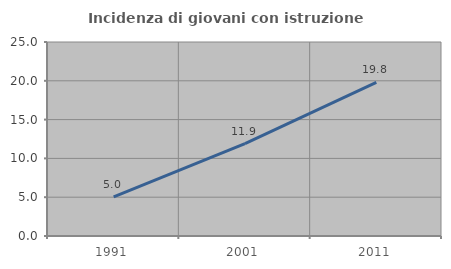
| Category | Incidenza di giovani con istruzione universitaria |
|---|---|
| 1991.0 | 5.042 |
| 2001.0 | 11.905 |
| 2011.0 | 19.802 |